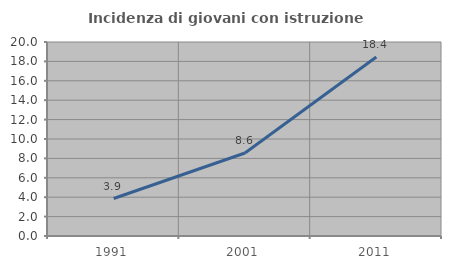
| Category | Incidenza di giovani con istruzione universitaria |
|---|---|
| 1991.0 | 3.865 |
| 2001.0 | 8.56 |
| 2011.0 | 18.445 |